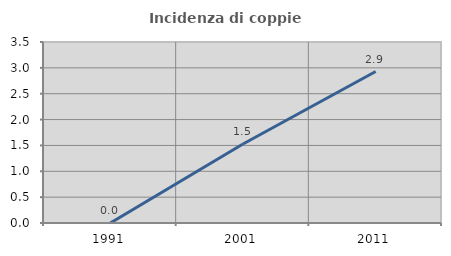
| Category | Incidenza di coppie miste |
|---|---|
| 1991.0 | 0 |
| 2001.0 | 1.527 |
| 2011.0 | 2.929 |